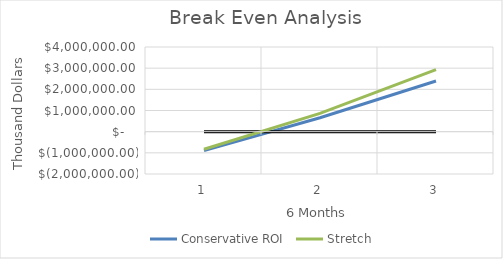
| Category | Conservative ROI | Series 1 | Stretch |
|---|---|---|---|
| 0 | -895807.574 | 0 | -828307.574 |
| 1 | 658659.085 | 0 | 861159.085 |
| 2 | 2392171.901 | 0 | 2932171.901 |